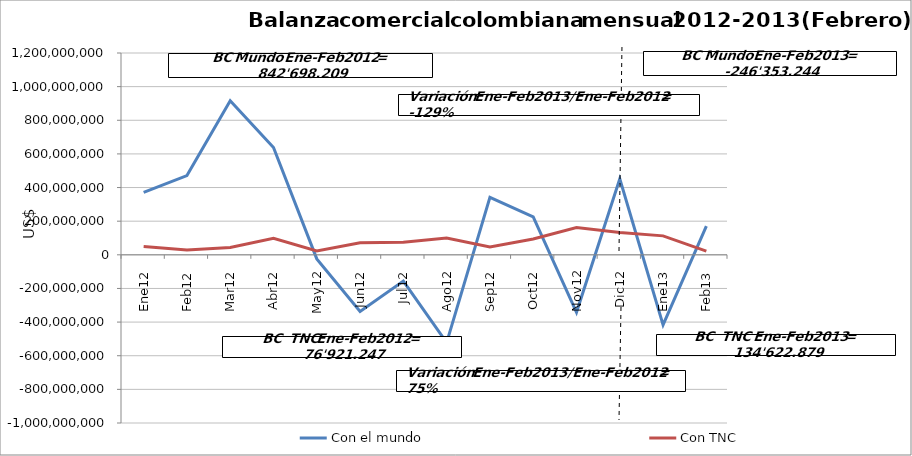
| Category | Con el mundo | Con TNC |
|---|---|---|
| 0 | 371588601.84 | 48912425.18 |
| 1 | 471109607.31 | 28008821.98 |
| 2 | 915911670.59 | 43945467.43 |
| 3 | 637706812.67 | 98809492.13 |
| 4 | -24278377.48 | 23094250.39 |
| 5 | -336582158.92 | 72178754.99 |
| 6 | -156141093.75 | 75283260.24 |
| 7 | -522487753.65 | 100426789.92 |
| 8 | 341551791.65 | 46867084.6 |
| 9 | 224887257.5 | 94244119.7 |
| 10 | -341510254.09 | 161644240.16 |
| 11 | 452349103.5 | 132043103.86 |
| 12 | -416629494.45 | 112730267.14 |
| 13 | 170276250.68 | 21892611.66 |